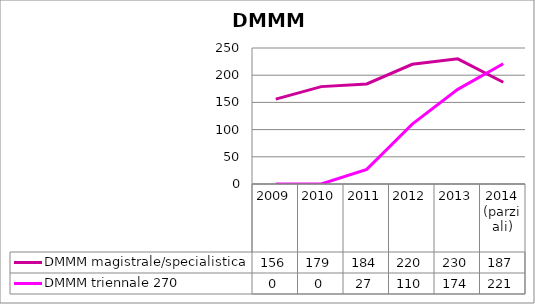
| Category | DMMM magistrale/specialistica | DMMM triennale 270 |
|---|---|---|
| 2009 | 156 | 0 |
| 2010 | 179 | 0 |
| 2011 | 184 | 27 |
| 2012 | 220 | 110 |
| 2013 | 230 | 174 |
| 2014
(parziali) | 187 | 221 |